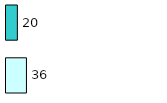
| Category | Series 0 | Series 1 |
|---|---|---|
| 0 | 36 | 20 |